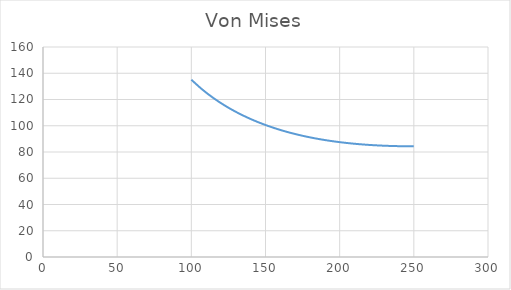
| Category | Von Mises |
|---|---|
| 100.0 | 135.076 |
| 107.5 | 127.502 |
| 115.0 | 121.022 |
| 122.5 | 115.436 |
| 130.0 | 110.597 |
| 137.5 | 106.392 |
| 145.0 | 102.734 |
| 152.5 | 99.553 |
| 160.0 | 96.793 |
| 167.5 | 94.405 |
| 175.0 | 92.351 |
| 182.5 | 90.596 |
| 190.0 | 89.111 |
| 197.5 | 87.87 |
| 205.0 | 86.848 |
| 212.5 | 86.026 |
| 220.0 | 85.384 |
| 227.5 | 84.906 |
| 235.0 | 84.576 |
| 242.5 | 84.38 |
| 250.0 | 84.304 |